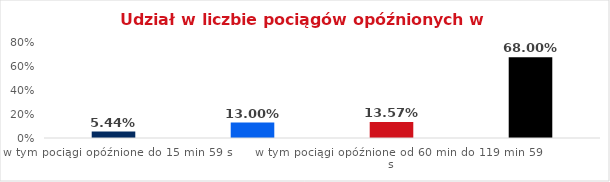
| Category | Series 0 |
|---|---|
| w tym pociągi opóźnione do 15 min 59 s | 0.054 |
| w tym pociągi opóźnione od 16 min do 59 min 59 s | 0.13 |
| w tym pociągi opóźnione od 60 min do 119 min 59 s | 0.136 |
| w tym pociągi opóźnione od 120 min | 0.68 |